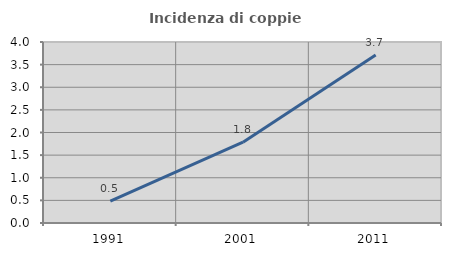
| Category | Incidenza di coppie miste |
|---|---|
| 1991.0 | 0.485 |
| 2001.0 | 1.785 |
| 2011.0 | 3.711 |